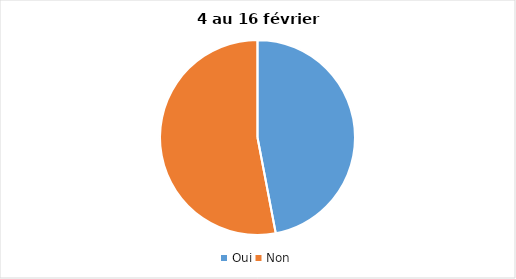
| Category | Series 0 |
|---|---|
| Oui | 47 |
| Non | 53 |